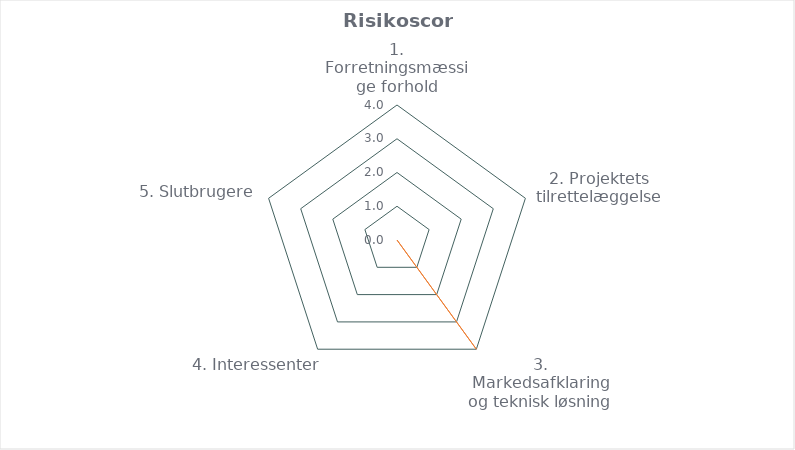
| Category | Series 0 | Series 1 |
|---|---|---|
| 1. Forretningsmæssige forhold | 0 |  |
| 2. Projektets tilrettelæggelse | 0 |  |
| 3. Markedsafklaring og teknisk løsning | 4 |  |
| 4. Interessenter | 0 |  |
| 5. Slutbrugere | 0 |  |